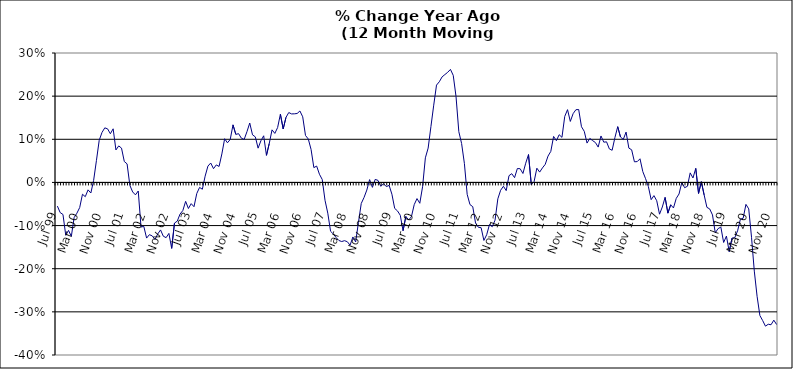
| Category | Series 0 |
|---|---|
| Jul 99 | -0.055 |
| Aug 99 | -0.07 |
| Sep 99 | -0.074 |
| Oct 99 | -0.123 |
| Nov 99 | -0.111 |
| Dec 99 | -0.125 |
| Jan 00 | -0.082 |
| Feb 00 | -0.071 |
| Mar 00 | -0.058 |
| Apr 00 | -0.027 |
| May 00 | -0.033 |
| Jun 00 | -0.017 |
| Jul 00 | -0.025 |
| Aug 00 | 0.005 |
| Sep 00 | 0.05 |
| Oct 00 | 0.098 |
| Nov 00 | 0.116 |
| Dec 00 | 0.127 |
| Jan 01 | 0.124 |
| Feb 01 | 0.113 |
| Mar 01 | 0.124 |
| Apr 01 | 0.075 |
| May 01 | 0.085 |
| Jun 01 | 0.08 |
| Jul 01 | 0.048 |
| Aug 01 | 0.043 |
| Sep 01 | -0.007 |
| Oct 01 | -0.022 |
| Nov 01 | -0.029 |
| Dec 01 | -0.02 |
| Jan 02 | -0.103 |
| Feb 02 | -0.102 |
| Mar 02 | -0.129 |
| Apr 02 | -0.121 |
| May 02 | -0.124 |
| Jun 02 | -0.132 |
| Jul 02 | -0.119 |
| Aug 02 | -0.11 |
| Sep 02 | -0.125 |
| Oct 02 | -0.128 |
| Nov 02 | -0.118 |
| Dec 02 | -0.153 |
| Jan 03 | -0.094 |
| Feb 03 | -0.09 |
| Mar 03 | -0.073 |
| Apr 03 | -0.065 |
| May 03 | -0.044 |
| Jun 03 | -0.06 |
| Jul 03 | -0.049 |
| Aug 03 | -0.056 |
| Sep 03 | -0.026 |
| Oct 03 | -0.012 |
| Nov 03 | -0.016 |
| Dec 03 | 0.014 |
| Jan 04 | 0.038 |
| Feb 04 | 0.045 |
| Mar 04 | 0.032 |
| Apr 04 | 0.041 |
| May 04 | 0.037 |
| Jun 04 | 0.066 |
| Jul 04 | 0.101 |
| Aug 04 | 0.092 |
| Sep 04 | 0.1 |
| Oct 04 | 0.133 |
| Nov 04 | 0.111 |
| Dec 04 | 0.113 |
| Jan 05 | 0.103 |
| Feb 05 | 0.1 |
| Mar 05 | 0.118 |
| Apr 05 | 0.138 |
| May 05 | 0.11 |
| Jun 05 | 0.106 |
| Jul 05 | 0.079 |
| Aug 05 | 0.097 |
| Sep 05 | 0.108 |
| Oct 05 | 0.063 |
| Nov 05 | 0.09 |
| Dec 05 | 0.122 |
| Jan 06 | 0.114 |
| Feb 06 | 0.127 |
| Mar 06 | 0.158 |
| Apr 06 | 0.124 |
| May 06 | 0.151 |
| Jun 06 | 0.162 |
| Jul 06 | 0.159 |
| Aug 06 | 0.159 |
| Sep 06 | 0.16 |
| Oct 06 | 0.166 |
| Nov 06 | 0.152 |
| Dec 06 | 0.109 |
| Jan 07 | 0.101 |
| Feb 07 | 0.076 |
| Mar 07 | 0.034 |
| Apr 07 | 0.038 |
| May 07 | 0.019 |
| Jun 07 | 0.007 |
| Jul 07 | -0.041 |
| Aug 07 | -0.071 |
| Sep 07 | -0.113 |
| Oct 07 | -0.12 |
| Nov 07 | -0.128 |
| Dec 07 | -0.135 |
| Jan 08 | -0.137 |
| Feb 08 | -0.135 |
| Mar 08 | -0.137 |
| Apr 08 | -0.145 |
| May 08 | -0.126 |
| Jun 08 | -0.138 |
| Jul 08 | -0.093 |
| Aug 08 | -0.049 |
| Sep-08 | -0.035 |
| Oct 08 | -0.018 |
| Nov 08 | 0.007 |
| Dec 08 | -0.011 |
| Jan 09 | 0.007 |
| Feb 09 | 0.005 |
| Mar 09 | -0.009 |
| Apr 09 | -0.003 |
| May 09 | -0.01 |
| Jun 09 | -0.007 |
| Jul 09 | -0.027 |
| Aug 09 | -0.06 |
| Sep 09 | -0.066 |
| Oct 09 | -0.076 |
| Nov 09 | -0.112 |
| Dec 09 | -0.079 |
| Jan 10 | -0.087 |
| Feb 10 | -0.079 |
| Mar 10 | -0.052 |
| Apr 10 | -0.037 |
| May 10 | -0.048 |
| Jun 10 | -0.01 |
| Jul 10 | 0.057 |
| Aug 10 | 0.08 |
| Sep 10 | 0.13 |
| Oct 10 | 0.179 |
| Nov 10 | 0.226 |
| Dec 10 | 0.233 |
| Jan 11 | 0.245 |
| Feb 11 | 0.25 |
| Mar 11 | 0.255 |
| Apr 11 | 0.262 |
| May 11 | 0.248 |
| Jun 11 | 0.199 |
| Jul 11 | 0.118 |
| Aug 11 | 0.09 |
| Sep 11 | 0.044 |
| Oct 11 | -0.028 |
| Nov 11 | -0.051 |
| Dec 11 | -0.056 |
| Jan 12 | -0.094 |
| Feb 12 | -0.104 |
| Mar 12 | -0.105 |
| Apr 12 | -0.134 |
| May 12 | -0.121 |
| Jun 12 | -0.098 |
| Jul 12 | -0.103 |
| Aug 12 | -0.087 |
| Sep 12 | -0.038 |
| Oct 12 | -0.018 |
| Nov 12 | -0.009 |
| Dec 12 | -0.019 |
| Jan 13 | 0.016 |
| Feb-13 | 0.02 |
| Mar-13 | 0.011 |
| Apr 13 | 0.032 |
| May 13 | 0.032 |
| Jun-13 | 0.021 |
| Jul 13 | 0.045 |
| Aug 13 | 0.065 |
| Sep 13 | -0.005 |
| Oct 13 | 0.002 |
| Nov 13 | 0.033 |
| Dec 13 | 0.024 |
| Jan 14 | 0.034 |
| Feb-14 | 0.042 |
| Mar 14 | 0.061 |
| Apr 14 | 0.072 |
| May 14 | 0.107 |
| Jun 14 | 0.097 |
| Jul-14 | 0.111 |
| Aug-14 | 0.105 |
| Sep 14 | 0.153 |
| Oct 14 | 0.169 |
| Nov 14 | 0.141 |
| Dec 14 | 0.159 |
| Jan 15 | 0.169 |
| Feb 15 | 0.169 |
| Mar 15 | 0.129 |
| Apr-15 | 0.118 |
| May 15 | 0.091 |
| Jun-15 | 0.102 |
| Jul 15 | 0.097 |
| Aug 15 | 0.092 |
| Sep 15 | 0.082 |
| Oct 15 | 0.108 |
| Nov 15 | 0.093 |
| Dec 15 | 0.094 |
| Jan 16 | 0.078 |
| Feb 16 | 0.075 |
| Mar 16 | 0.104 |
| Apr 16 | 0.129 |
| May 16 | 0.105 |
| Jun 16 | 0.1 |
| Jul 16 | 0.117 |
| Aug 16 | 0.08 |
| Sep 16 | 0.076 |
| Oct 16 | 0.048 |
| Nov 16 | 0.048 |
| Dec 16 | 0.055 |
| Jan 17 | 0.025 |
| Feb 17 | 0.009 |
| Mar 17 | -0.01 |
| Apr 17 | -0.04 |
| May 17 | -0.031 |
| Jun 17 | -0.042 |
| Jul 17 | -0.074 |
| Aug 17 | -0.057 |
| Sep 17 | -0.035 |
| Oct 17 | -0.071 |
| Nov 17 | -0.052 |
| Dec 17 | -0.059 |
| Jan 18 | -0.037 |
| Feb 18 | -0.027 |
| Mar 18 | 0 |
| Apr 18 | -0.012 |
| May 18 | -0.009 |
| Jun 18 | 0.022 |
| Jul 18 | 0.01 |
| Aug 18 | 0.033 |
| Sep 18 | -0.025 |
| Oct 18 | 0.002 |
| Nov 18 | -0.029 |
| Dec 18 | -0.058 |
| Jan 19 | -0.061 |
| Feb 19 | -0.075 |
| Mar 19 | -0.117 |
| Apr 19 | -0.107 |
| May 19 | -0.104 |
| Jun 19 | -0.139 |
| Jul 19 | -0.124 |
| Aug 19 | -0.16 |
| Sep 19 | -0.129 |
| Oct 19 | -0.128 |
| Nov 19 | -0.112 |
| Dec 19 | -0.085 |
| Jan 20 | -0.083 |
| Feb 20 | -0.051 |
| Mar 20 | -0.061 |
| Apr 20 | -0.127 |
| May 20 | -0.206 |
| Jun 20 | -0.264 |
| Jul 20 | -0.308 |
| Aug 20 | -0.32 |
| Sep 20 | -0.333 |
| Oct 20 | -0.329 |
| Nov 20 | -0.33 |
| Dec 20 | -0.319 |
| Jan 21 | -0.329 |